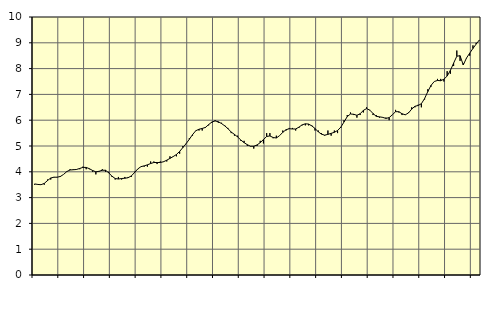
| Category | Piggar | Information och kommunikation, SNI 58-631 |
|---|---|---|
| nan | 3.5 | 3.53 |
| 87.0 | 3.5 | 3.51 |
| 87.0 | 3.5 | 3.5 |
| 87.0 | 3.5 | 3.55 |
| nan | 3.7 | 3.66 |
| 88.0 | 3.7 | 3.76 |
| 88.0 | 3.8 | 3.79 |
| 88.0 | 3.8 | 3.79 |
| nan | 3.8 | 3.82 |
| 89.0 | 3.9 | 3.9 |
| 89.0 | 4 | 4.01 |
| 89.0 | 4.1 | 4.07 |
| nan | 4.1 | 4.08 |
| 90.0 | 4.1 | 4.09 |
| 90.0 | 4.1 | 4.13 |
| 90.0 | 4.2 | 4.17 |
| nan | 4.1 | 4.17 |
| 91.0 | 4.1 | 4.12 |
| 91.0 | 4 | 4.05 |
| 91.0 | 3.9 | 4 |
| nan | 4 | 4.02 |
| 92.0 | 4.1 | 4.06 |
| 92.0 | 4 | 4.06 |
| 92.0 | 4 | 3.96 |
| nan | 3.8 | 3.83 |
| 93.0 | 3.7 | 3.74 |
| 93.0 | 3.8 | 3.72 |
| 93.0 | 3.7 | 3.74 |
| nan | 3.8 | 3.75 |
| 94.0 | 3.8 | 3.77 |
| 94.0 | 3.8 | 3.84 |
| 94.0 | 4 | 3.97 |
| nan | 4.1 | 4.11 |
| 95.0 | 4.2 | 4.2 |
| 95.0 | 4.2 | 4.23 |
| 95.0 | 4.2 | 4.27 |
| nan | 4.4 | 4.32 |
| 96.0 | 4.4 | 4.36 |
| 96.0 | 4.3 | 4.36 |
| 96.0 | 4.4 | 4.36 |
| nan | 4.4 | 4.39 |
| 97.0 | 4.4 | 4.45 |
| 97.0 | 4.6 | 4.52 |
| 97.0 | 4.6 | 4.59 |
| nan | 4.6 | 4.67 |
| 98.0 | 4.7 | 4.79 |
| 98.0 | 5 | 4.94 |
| 98.0 | 5.1 | 5.09 |
| nan | 5.3 | 5.26 |
| 99.0 | 5.4 | 5.44 |
| 99.0 | 5.6 | 5.59 |
| 99.0 | 5.6 | 5.65 |
| nan | 5.6 | 5.68 |
| 0.0 | 5.7 | 5.72 |
| 0.0 | 5.8 | 5.83 |
| 0.0 | 5.9 | 5.93 |
| nan | 6 | 5.97 |
| 1.0 | 5.9 | 5.94 |
| 1.0 | 5.9 | 5.87 |
| 1.0 | 5.8 | 5.78 |
| nan | 5.7 | 5.67 |
| 2.0 | 5.5 | 5.54 |
| 2.0 | 5.4 | 5.45 |
| 2.0 | 5.4 | 5.35 |
| nan | 5.2 | 5.23 |
| 3.0 | 5.2 | 5.13 |
| 3.0 | 5 | 5.05 |
| 3.0 | 5 | 4.99 |
| nan | 4.9 | 4.99 |
| 4.0 | 5 | 5.04 |
| 4.0 | 5.2 | 5.13 |
| 4.0 | 5.1 | 5.25 |
| nan | 5.5 | 5.37 |
| 5.0 | 5.5 | 5.39 |
| 5.0 | 5.3 | 5.33 |
| 5.0 | 5.4 | 5.31 |
| nan | 5.4 | 5.4 |
| 6.0 | 5.6 | 5.53 |
| 6.0 | 5.6 | 5.63 |
| 6.0 | 5.7 | 5.67 |
| nan | 5.7 | 5.66 |
| 7.0 | 5.6 | 5.66 |
| 7.0 | 5.7 | 5.73 |
| 7.0 | 5.8 | 5.82 |
| nan | 5.8 | 5.86 |
| 8.0 | 5.8 | 5.85 |
| 8.0 | 5.8 | 5.78 |
| 8.0 | 5.6 | 5.68 |
| nan | 5.6 | 5.55 |
| 9.0 | 5.5 | 5.46 |
| 9.0 | 5.4 | 5.42 |
| 9.0 | 5.6 | 5.45 |
| nan | 5.4 | 5.49 |
| 10.0 | 5.6 | 5.53 |
| 10.0 | 5.5 | 5.6 |
| 10.0 | 5.7 | 5.73 |
| nan | 6 | 5.93 |
| 11.0 | 6.2 | 6.14 |
| 11.0 | 6.3 | 6.24 |
| 11.0 | 6.2 | 6.23 |
| nan | 6.1 | 6.19 |
| 12.0 | 6.2 | 6.25 |
| 12.0 | 6.3 | 6.38 |
| 12.0 | 6.5 | 6.45 |
| nan | 6.4 | 6.39 |
| 13.0 | 6.2 | 6.26 |
| 13.0 | 6.2 | 6.15 |
| 13.0 | 6.1 | 6.13 |
| nan | 6.1 | 6.11 |
| 14.0 | 6.1 | 6.07 |
| 14.0 | 6 | 6.1 |
| 14.0 | 6.2 | 6.21 |
| nan | 6.4 | 6.33 |
| 15.0 | 6.3 | 6.33 |
| 15.0 | 6.2 | 6.25 |
| 15.0 | 6.2 | 6.21 |
| nan | 6.3 | 6.28 |
| 16.0 | 6.5 | 6.43 |
| 16.0 | 6.5 | 6.54 |
| 16.0 | 6.6 | 6.57 |
| nan | 6.5 | 6.64 |
| 17.0 | 6.8 | 6.84 |
| 17.0 | 7.2 | 7.11 |
| 17.0 | 7.3 | 7.35 |
| nan | 7.5 | 7.5 |
| 18.0 | 7.6 | 7.54 |
| 18.0 | 7.6 | 7.53 |
| 18.0 | 7.5 | 7.59 |
| nan | 7.9 | 7.71 |
| 19.0 | 7.8 | 7.93 |
| 19.0 | 8.1 | 8.21 |
| 19.0 | 8.7 | 8.48 |
| nan | 8.3 | 8.5 |
| 20.0 | 8.2 | 8.14 |
| 20.0 | 8.4 | 8.41 |
| 20.0 | 8.5 | 8.6 |
| nan | 8.9 | 8.78 |
| 21.0 | 9 | 8.95 |
| 21.0 | 9.1 | 9.11 |